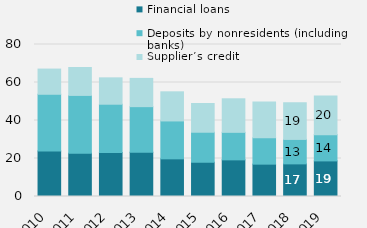
| Category | Financial loans | Deposits by nonresidents (including banks) | Supplier’s credit |
|---|---|---|---|
| 2010.0 | 23947.662 | 29859.414 | 13259 |
| 2011.0 | 22755.955 | 30449.304 | 14698 |
| 2012.0 | 23113.288 | 25457.574 | 13873 |
| 2013.0 | 23270.921 | 24017.84 | 14878 |
| 2014.0 | 19819.895 | 19942.706 | 15331 |
| 2015.0 | 18029.865 | 15793.872 | 15134 |
| 2016.0 | 19285.463 | 14489.081 | 17648 |
| 2017.0 | 17024.69 | 13855.994 | 18808 |
| 2018.0 | 17168.663 | 12872.362 | 19297 |
| 2019.0 | 18732 | 13823 | 20355 |